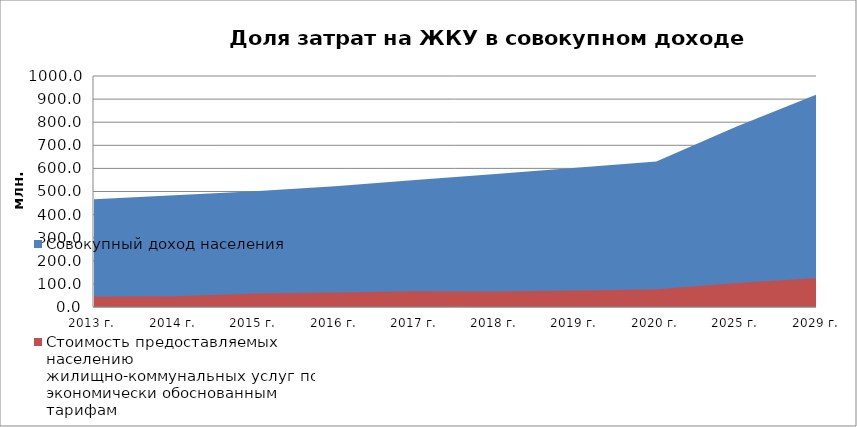
| Category | Совокупный доход населения | Стоимость предоставляемых населению жилищно-коммунальных услуг по экономически обоснованным тарифам |
|---|---|---|
| 2013 г. | 466.766 | 45.276 |
| 2014 г. | 483.374 | 46.472 |
| 2015 г. | 501.379 | 58.374 |
| 2016 г. | 522.77 | 62.693 |
| 2017 г. | 550.216 | 67.941 |
| 2018 г. | 575.662 | 66.567 |
| 2019 г. | 602.748 | 71.791 |
| 2020 г. | 629.52 | 76.727 |
| 2025 г. | 780.997 | 104.321 |
| 2029 г. | 920.038 | 125.573 |